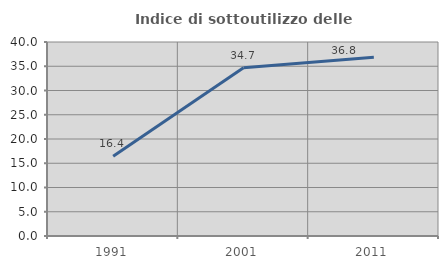
| Category | Indice di sottoutilizzo delle abitazioni  |
|---|---|
| 1991.0 | 16.447 |
| 2001.0 | 34.694 |
| 2011.0 | 36.842 |